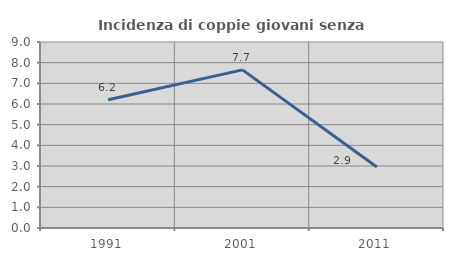
| Category | Incidenza di coppie giovani senza figli |
|---|---|
| 1991.0 | 6.209 |
| 2001.0 | 7.65 |
| 2011.0 | 2.949 |